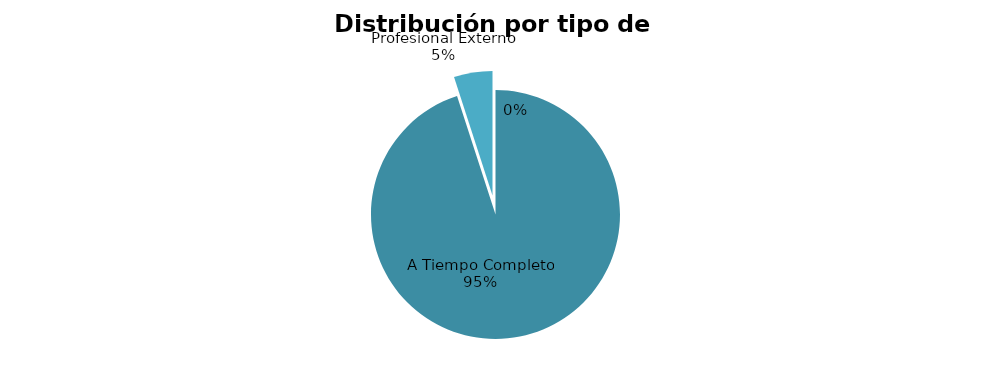
| Category | 19 |
|---|---|
| A Tiempo Completo | 19 |
| Profesional Externo | 1 |